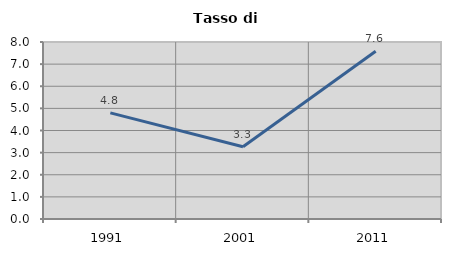
| Category | Tasso di disoccupazione   |
|---|---|
| 1991.0 | 4.796 |
| 2001.0 | 3.267 |
| 2011.0 | 7.581 |